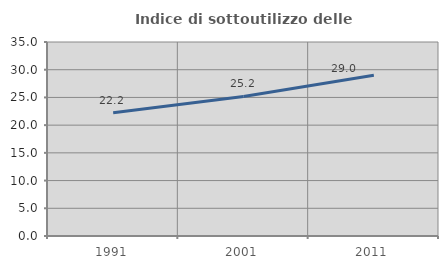
| Category | Indice di sottoutilizzo delle abitazioni  |
|---|---|
| 1991.0 | 22.241 |
| 2001.0 | 25.172 |
| 2011.0 | 29.02 |